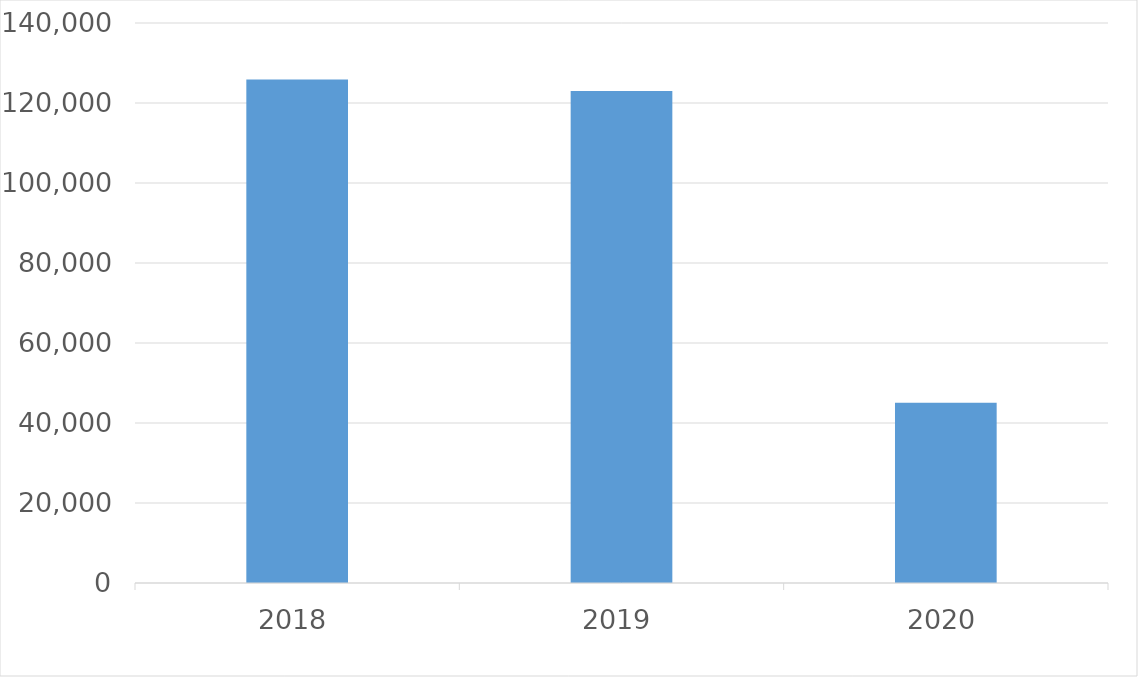
| Category | Series 0 |
|---|---|
| 2018 | 125847 |
| 2019 | 122993 |
| 2020 | 45089 |